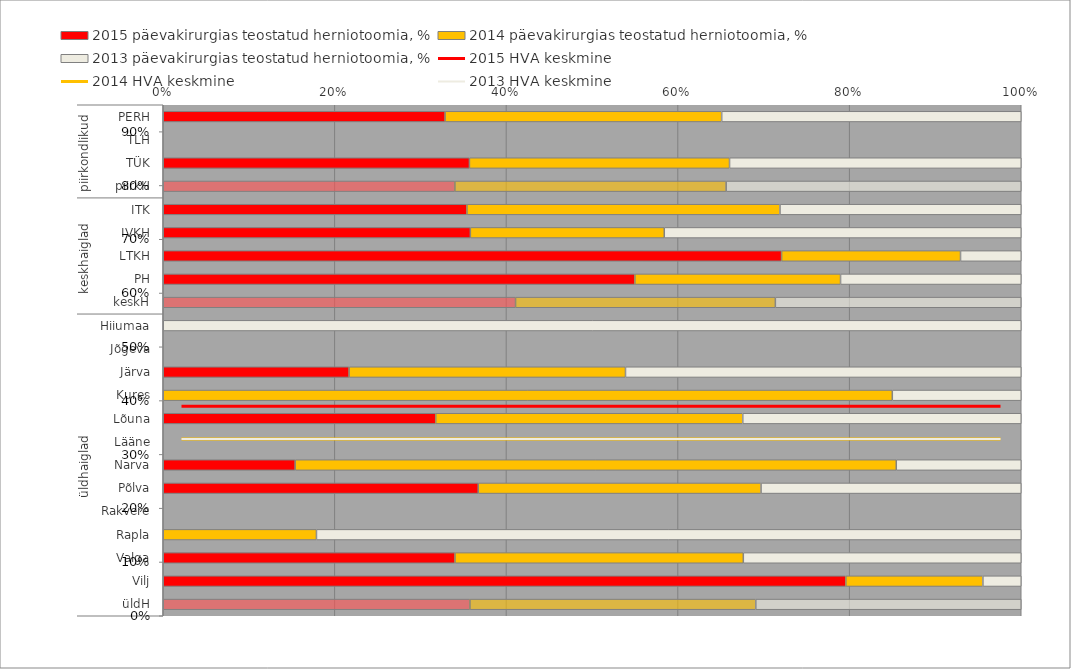
| Category | 2015 päevakirurgias teostatud herniotoomia, % | 2014 päevakirurgias teostatud herniotoomia, % | 2013 päevakirurgias teostatud herniotoomia, % |
|---|---|---|---|
| 0 | 0.615 | 0.604 | 0.654 |
| 1 | 0 | 0 | 0 |
| 2 | 0.512 | 0.435 | 0.488 |
| 3 | 0.56 | 0.521 | 0.567 |
| 4 | 0.647 | 0.667 | 0.514 |
| 5 | 0.519 | 0.327 | 0.603 |
| 6 | 0.202 | 0.058 | 0.02 |
| 7 | 0.093 | 0.041 | 0.036 |
| 8 | 0.38 | 0.28 | 0.265 |
| 9 | 0 | 0 | 0.056 |
| 10 | 0 | 0 | 0 |
| 11 | 0.151 | 0.224 | 0.321 |
| 12 | 0 | 0.231 | 0.041 |
| 13 | 0.525 | 0.592 | 0.537 |
| 14 | 0 | 0 | 0 |
| 15 | 0.014 | 0.063 | 0.013 |
| 16 | 0.949 | 0.852 | 0.784 |
| 17 | 0 | 0 | 0 |
| 18 | 0 | 0.065 | 0.3 |
| 19 | 0.947 | 0.936 | 0.902 |
| 20 | 0.531 | 0.107 | 0.03 |
| 21 | 0.28 | 0.261 | 0.242 |